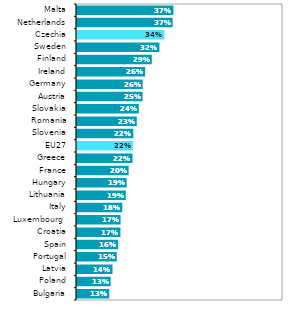
| Category | Series 1 |
|---|---|
| Bulgaria | 0.125 |
| Poland | 0.13 |
| Latvia | 0.138 |
| Portugal | 0.154 |
| Spain | 0.16 |
| Croatia | 0.169 |
| Luxembourg  | 0.169 |
| Italy | 0.176 |
| Lithuania | 0.189 |
| Hungary | 0.193 |
| France | 0.2 |
| Greece | 0.215 |
| EU27 | 0.217 |
| Slovenia | 0.219 |
| Romania | 0.232 |
| Slovakia | 0.24 |
| Austria | 0.254 |
| Germany | 0.255 |
| Ireland | 0.265 |
| Finland | 0.29 |
| Sweden | 0.32 |
| Czechia | 0.339 |
| Netherlands | 0.371 |
| Malta | 0.375 |